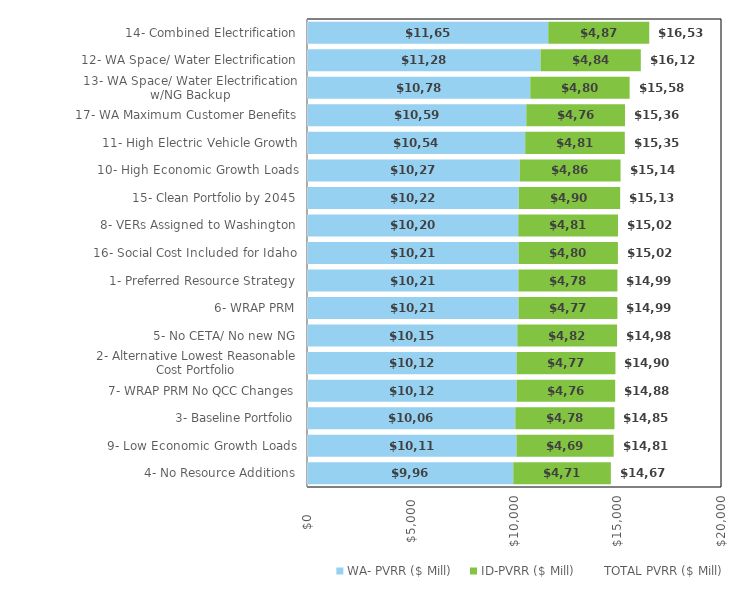
| Category | WA- PVRR ($ Mill) | ID-PVRR ($ Mill) | TOTAL PVRR ($ Mill) |
|---|---|---|---|
| 4- No Resource Additions | 9965.81 | 4713.202 | 14679.012 |
| 9- Low Economic Growth Loads | 10118.85 | 4697.063 | 14815.913 |
| 3- Baseline Portfolio | 10063.546 | 4788.751 | 14852.297 |
| 7- WRAP PRM No QCC Changes | 10126.066 | 4763.413 | 14889.479 |
| 2- Alternative Lowest Reasonable Cost Portfolio | 10122.157 | 4777.898 | 14900.054 |
| 5- No CETA/ No new NG | 10158.418 | 4821.263 | 14979.681 |
| 6- WRAP PRM | 10217.188 | 4777.909 | 14995.097 |
| 1- Preferred Resource Strategy | 10212.542 | 4783.121 | 14995.663 |
| 16- Social Cost Included for Idaho | 10219.446 | 4801.161 | 15020.606 |
| 8- VERs Assigned to Washington | 10205.1 | 4819.249 | 15024.349 |
| 15- Clean Portfolio by 2045 | 10227.16 | 4902.425 | 15129.584 |
| 10- High Economic Growth Loads | 10279.442 | 4868.207 | 15147.649 |
| 11- High Electric Vehicle Growth | 10541.423 | 4812.149 | 15353.572 |
| 17- WA Maximum Customer Benefits | 10593.672 | 4769.222 | 15362.894 |
| 13- WA Space/ Water Electrification w/NG Backup | 10786.818 | 4799.593 | 15586.41 |
| 12- WA Space/ Water Electrification | 11283.173 | 4842.594 | 16125.767 |
| 14- Combined Electrification | 11654.611 | 4878.596 | 16533.207 |